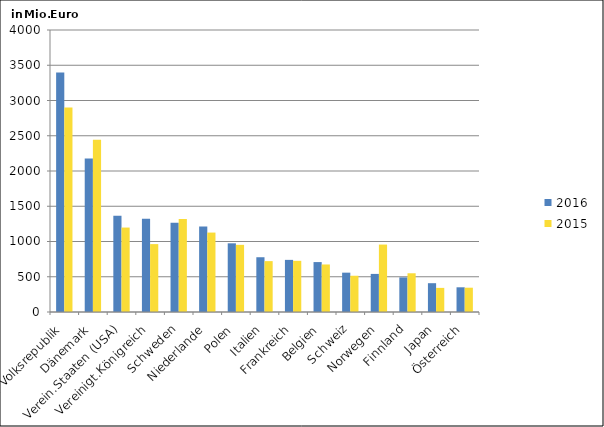
| Category | 2016 | 2015 |
|---|---|---|
| China, Volksrepublik | 3397.054 | 2901.411 |
| Dänemark | 2176.442 | 2443.064 |
| Verein.Staaten (USA) | 1366.311 | 1197.773 |
| Vereinigt.Königreich | 1323.488 | 963.004 |
| Schweden | 1266.044 | 1320.613 |
| Niederlande | 1211.533 | 1126.642 |
| Polen | 974.208 | 952.52 |
| Italien | 776.756 | 721.579 |
| Frankreich | 739.417 | 725.884 |
| Belgien | 708.121 | 674.154 |
| Schweiz | 558.022 | 514.153 |
| Norwegen | 540.315 | 956.461 |
| Finnland | 490.661 | 549.343 |
| Japan | 408.552 | 342.081 |
| Österreich | 350.386 | 344.553 |